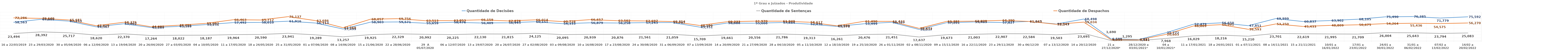
| Category | Quantidade de Decisões | Quantidade de Sentenças |
|---|---|---|
| 16 a 22/03/2019 | 58563 | 23494 |
| 23 a 29/03/2020 | 67809 | 28392 |
| 30 a 05/04/2020 | 62233 | 25717 |
| 06 a 12/04/2020 | 44367 | 18620 |
| 13 a 19/04/2020 | 53802 | 22370 |
| 20 a 26/04/2020 | 42169 | 17264 |
| 27 a 03/05/2020 | 45599 | 18022 |
| 04 a 10/05/2020 | 51251 | 18187 |
| 11 a 17/05/2020 | 57492 | 19964 |
| 18 a 24/05/2020 | 58010 | 20590 |
| 25 a 31/05/2020 | 61916 | 23941 |
| 01 a 07/06/2020 | 56113 | 19289 |
| 08 a 14/06/2020 | 37499 | 13257 |
| 15 a 21/06/2020 | 58903 | 19925 |
| 22 a 28/06/2020 | 59571 | 22329 |
| 29  A 05/07/2020 | 55659 | 20992 |
| 06 a 12/07/2020 | 58476 | 20225 |
| 13 a 19/07/2020 | 56409 | 22130 |
| 20 a 26/07/2020 | 56945 | 21815 |
| 27 a 02/08/2020 | 60151 | 24125 |
| 03 a 09/08/2020 | 54333 | 20095 |
| 10 a 16/08/2020 | 56879 | 20939 |
| 17 a 23/08/2020 | 56258 | 20876 |
| 24 a 30/08/2020 | 57243 | 21561 |
| 31 a 06/09/2020 | 57767 | 21059 |
| 07 a 13/09/2020 | 43351 | 15709 |
| 14 a 20/09/2020 | 56086 | 19661 |
| 21 a 27/09/2020 | 55666 | 20556 |
| 28 a 04/10/2020 | 57684 | 21786 |
| 05 a 11/10/2020 | 52836 | 19313 |
| 12 a 18/10/2020 | 45578 | 16261 |
| 19 a 25/10/2020 | 53999 | 20476 |
| 26 a 01/11/2020 | 58389 | 21451 |
| 02 a 08/11/2020 | 36037 | 12637 |
| 09 a 15/11/2020 | 57201 | 19673 |
| 16 a 22/11/2020 | 59483 | 21003 |
| 23 a 29/11/2020 | 57827 | 22907 |
| 30 a 06/12/20 | 61043 | 22584 |
| 07 a 13/12/2020 | 53145 | 19503 |
| 14 a 20/12/2020 | 68498 | 23695 |
| 21 a 27/12/2020* | 6508 | 1690 |
| 28/12/2020 a 03/01/2021* | 4811 | 1295 |
| 04 a 10/01/2021* | 25772 | 7968 |
| 11 a 17/01/2021 | 52479 | 16029 |
| 18 a 24/01/2021 | 56650 | 18216 |
| 01 a 07/11/2021 | 47851 | 15210 |
| 08 a 14/11/2021 | 69999 | 23701 |
| 15 a 21/11/2021 | 60837 | 22619 |
| 10/01 a 16/01/2022 | 63902 | 21995 |
| 17/01 a 23/01/2022 | 68105 | 21709 |
| 24/01 a 30/01/2022 | 75490 | 26004 |
| 31/01 a 06/02/2022 | 76385 | 25643 |
| 07/02 a 13/02/2022 | 71779 | 23794 |
| 14/02 a 20/02/2022 | 75592 | 25083 |